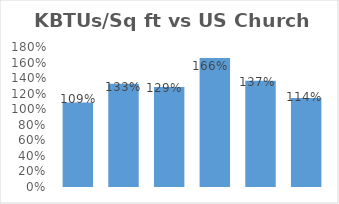
| Category | Series 0 |
|---|---|
| 0 | 1.086 |
| 1 | 1.328 |
| 2 | 1.286 |
| 3 | 1.657 |
| 4 | 1.367 |
| 5 | 1.145 |